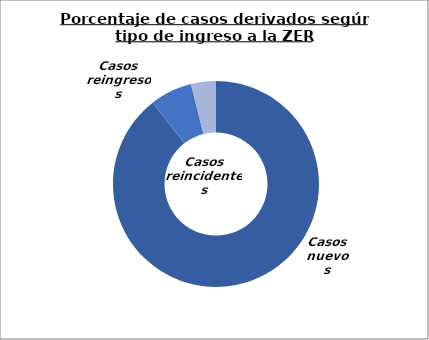
| Category | Series 0 |
|---|---|
| Casos nuevos | 1461 |
| Casos reincidentes | 108 |
| Casos reingresos | 64 |